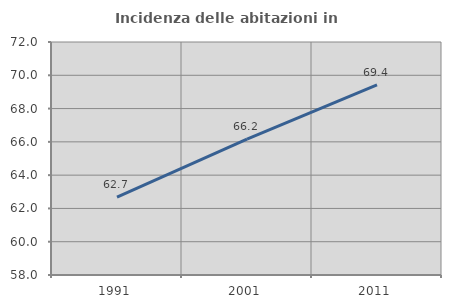
| Category | Incidenza delle abitazioni in proprietà  |
|---|---|
| 1991.0 | 62.676 |
| 2001.0 | 66.17 |
| 2011.0 | 69.43 |